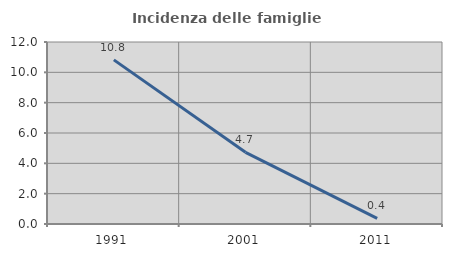
| Category | Incidenza delle famiglie numerose |
|---|---|
| 1991.0 | 10.821 |
| 2001.0 | 4.724 |
| 2011.0 | 0.365 |